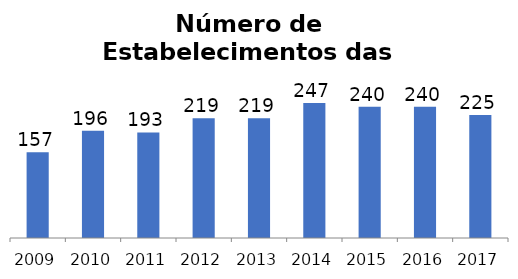
| Category | Total |
|---|---|
| 2009.0 | 157 |
| 2010.0 | 196 |
| 2011.0 | 193 |
| 2012.0 | 219 |
| 2013.0 | 219 |
| 2014.0 | 247 |
| 2015.0 | 240 |
| 2016.0 | 240 |
| 2017.0 | 225 |